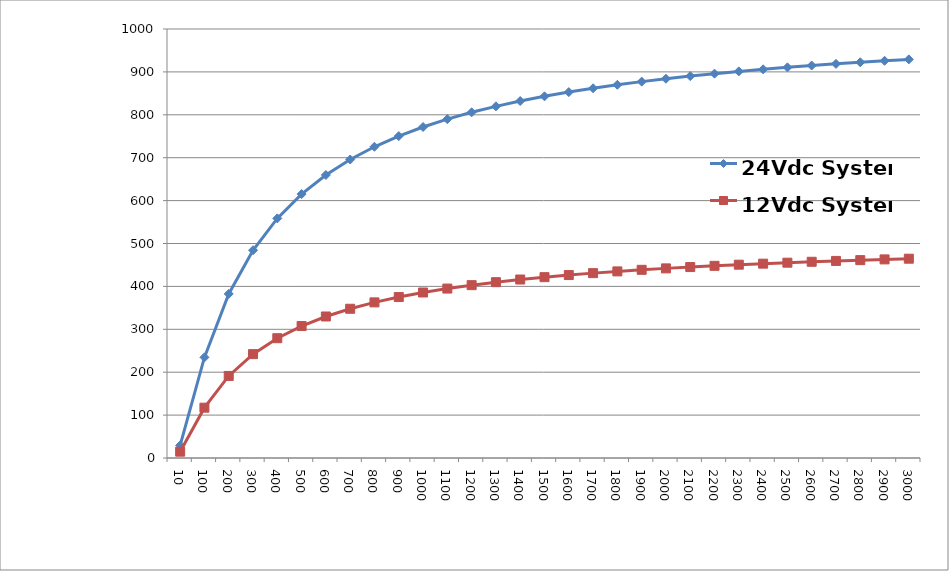
| Category | 24Vdc System | 12Vdc System |
|---|---|---|
| 10.0 | 29.476 | 14.738 |
| 100.0 | 234.616 | 117.308 |
| 200.0 | 382.506 | 191.253 |
| 300.0 | 484.256 | 242.128 |
| 400.0 | 558.545 | 279.273 |
| 500.0 | 615.169 | 307.584 |
| 600.0 | 659.758 | 329.879 |
| 700.0 | 695.782 | 347.891 |
| 800.0 | 725.491 | 362.745 |
| 900.0 | 750.412 | 375.206 |
| 1000.0 | 771.617 | 385.808 |
| 1100.0 | 789.879 | 394.939 |
| 1200.0 | 805.77 | 402.885 |
| 1300.0 | 819.725 | 409.863 |
| 1400.0 | 832.077 | 416.039 |
| 1500.0 | 843.087 | 421.544 |
| 1600.0 | 852.963 | 426.482 |
| 1700.0 | 861.871 | 430.936 |
| 1800.0 | 869.947 | 434.973 |
| 1900.0 | 877.302 | 438.651 |
| 2000.0 | 884.029 | 442.014 |
| 2100.0 | 890.204 | 445.102 |
| 2200.0 | 895.894 | 447.947 |
| 2300.0 | 901.153 | 450.576 |
| 2400.0 | 906.028 | 453.014 |
| 2500.0 | 910.559 | 455.28 |
| 2600.0 | 914.783 | 457.392 |
| 2700.0 | 918.729 | 459.364 |
| 2800.0 | 922.424 | 461.212 |
| 2900.0 | 925.89 | 462.945 |
| 3000.0 | 929.149 | 464.575 |